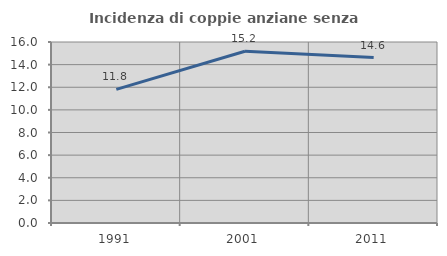
| Category | Incidenza di coppie anziane senza figli  |
|---|---|
| 1991.0 | 11.817 |
| 2001.0 | 15.186 |
| 2011.0 | 14.623 |